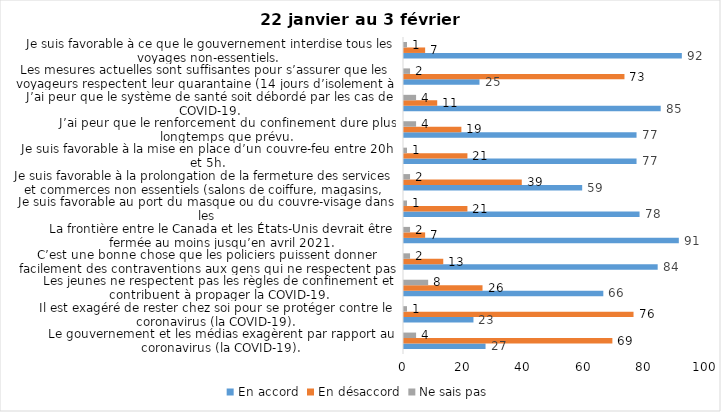
| Category | En accord | En désaccord | Ne sais pas |
|---|---|---|---|
| Le gouvernement et les médias exagèrent par rapport au coronavirus (la COVID-19). | 27 | 69 | 4 |
| Il est exagéré de rester chez soi pour se protéger contre le coronavirus (la COVID-19). | 23 | 76 | 1 |
| Les jeunes ne respectent pas les règles de confinement et contribuent à propager la COVID-19. | 66 | 26 | 8 |
| C’est une bonne chose que les policiers puissent donner facilement des contraventions aux gens qui ne respectent pas les mesures pour prévenir le coronavirus (la COVID-19). | 84 | 13 | 2 |
| La frontière entre le Canada et les États-Unis devrait être fermée au moins jusqu’en avril 2021. | 91 | 7 | 2 |
| Je suis favorable au port du masque ou du couvre-visage dans les
lieux publics extérieurs achalandés (ex. rues, parcs) | 78 | 21 | 1 |
| Je suis favorable à la prolongation de la fermeture des services et commerces non essentiels (salons de coiffure, magasins, industries) jusqu’au 8 février. | 59 | 39 | 2 |
| Je suis favorable à la mise en place d’un couvre-feu entre 20h et 5h. | 77 | 21 | 1 |
| J’ai peur que le renforcement du confinement dure plus longtemps que prévu. | 77 | 19 | 4 |
| J’ai peur que le système de santé soit débordé par les cas de COVID-19. | 85 | 11 | 4 |
| Les mesures actuelles sont suffisantes pour s’assurer que les voyageurs respectent leur quarantaine (14 jours d’isolement à la maison au retour d’un voyage). | 25 | 73 | 2 |
| Je suis favorable à ce que le gouvernement interdise tous les voyages non-essentiels. | 92 | 7 | 1 |